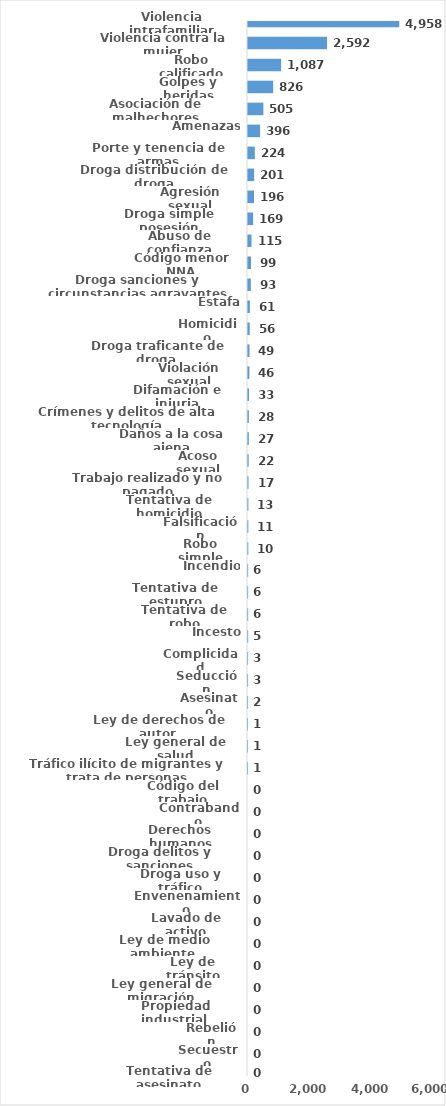
| Category | Series 0 |
|---|---|
| Violencia intrafamiliar | 4958 |
| Violencia contra la mujer | 2592 |
| Robo calificado | 1087 |
| Golpes y heridas | 826 |
| Asociación de malhechores | 505 |
| Amenazas | 396 |
| Porte y tenencia de armas | 224 |
| Droga distribución de droga | 201 |
| Agresión sexual | 196 |
| Droga simple posesión | 169 |
| Abuso de confianza | 115 |
| Código menor NNA | 99 |
| Droga sanciones y circunstancias agravantes | 93 |
| Estafa | 61 |
| Homicidio | 56 |
| Droga traficante de droga  | 49 |
| Violación sexual | 46 |
| Difamación e injuria | 33 |
| Crímenes y delitos de alta tecnología | 28 |
| Daños a la cosa ajena | 27 |
| Acoso sexual | 22 |
| Trabajo realizado y no pagado | 17 |
| Tentativa de homicidio | 13 |
| Falsificación | 11 |
| Robo simple | 10 |
| Incendio | 6 |
| Tentativa de estupro | 6 |
| Tentativa de robo | 6 |
| Incesto | 5 |
| Complicidad | 3 |
| Seducción | 3 |
| Asesinato | 2 |
| Ley de derechos de autor  | 1 |
| Ley general de salud | 1 |
| Tráfico ilícito de migrantes y trata de personas | 1 |
| Código del trabajo | 0 |
| Contrabando | 0 |
| Derechos humanos | 0 |
| Droga delitos y sanciones | 0 |
| Droga uso y tráfico | 0 |
| Envenenamiento | 0 |
| Lavado de activo | 0 |
| Ley de medio ambiente  | 0 |
| Ley de tránsito | 0 |
| Ley general de migración | 0 |
| Propiedad industrial  | 0 |
| Rebelión | 0 |
| Secuestro | 0 |
| Tentativa de asesinato | 0 |